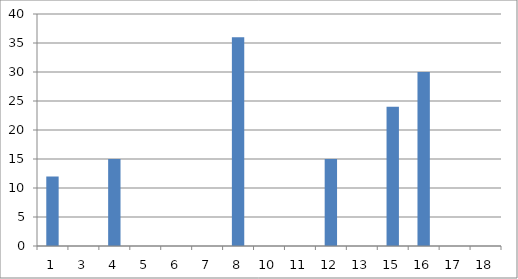
| Category | Series 0 |
|---|---|
| 1.0 | 12 |
| 3.0 | 0 |
| 4.0 | 15 |
| 5.0 | 0 |
| 6.0 | 0 |
| 7.0 | 0 |
| 8.0 | 36 |
| 10.0 | 0 |
| 11.0 | 0 |
| 12.0 | 15 |
| 13.0 | 0 |
| 15.0 | 24 |
| 16.0 | 30 |
| 17.0 | 0 |
| 18.0 | 0 |